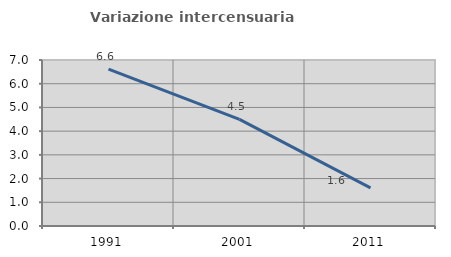
| Category | Variazione intercensuaria annua |
|---|---|
| 1991.0 | 6.618 |
| 2001.0 | 4.498 |
| 2011.0 | 1.604 |